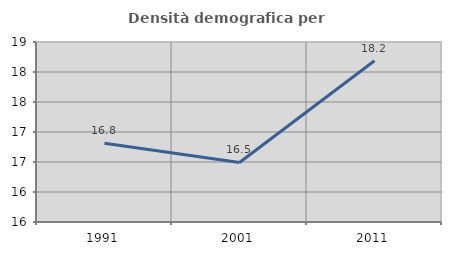
| Category | Densità demografica |
|---|---|
| 1991.0 | 16.813 |
| 2001.0 | 16.492 |
| 2011.0 | 18.186 |